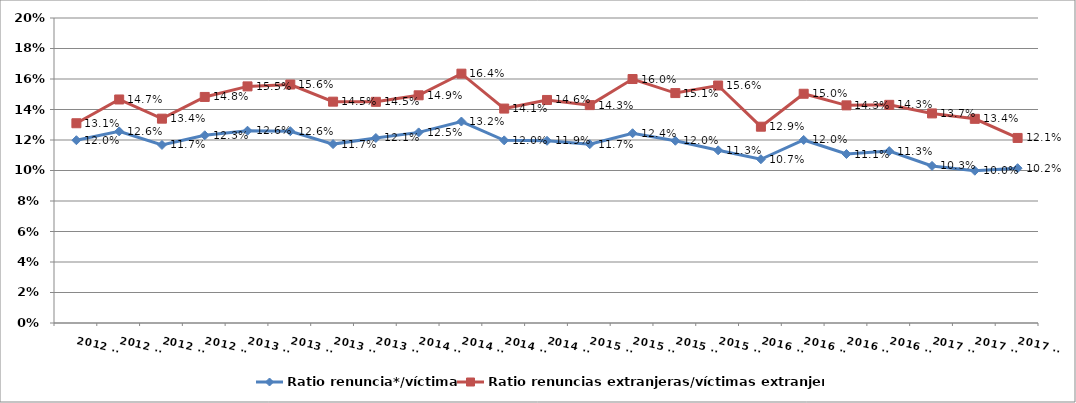
| Category | Ratio renuncia*/víctima | Ratio renuncias extranjeras/víctimas extranjeras |
|---|---|---|
| 2012 T1 | 0.12 | 0.131 |
| 2012 T2 | 0.126 | 0.147 |
| 2012 T3 | 0.117 | 0.134 |
| 2012 T4 | 0.123 | 0.148 |
| 2013 T1 | 0.126 | 0.155 |
| 2013 T2 | 0.126 | 0.156 |
| 2013 T3 | 0.117 | 0.145 |
| 2013 T4 | 0.121 | 0.145 |
| 2014 T1 | 0.125 | 0.149 |
| 2014 T2 | 0.132 | 0.164 |
| 2014 T3 | 0.12 | 0.141 |
| 2014 T4 | 0.119 | 0.146 |
| 2015 T1 | 0.117 | 0.143 |
| 2015 T2 | 0.124 | 0.16 |
| 2015 T3 | 0.12 | 0.151 |
| 2015 T4 | 0.113 | 0.156 |
| 2016 T1 | 0.107 | 0.129 |
| 2016 T2 | 0.12 | 0.15 |
| 2016 T3 | 0.111 | 0.143 |
| 2016 T4 | 0.113 | 0.143 |
| 2017 T1 | 0.103 | 0.137 |
| 2017 T2 | 0.1 | 0.134 |
| 2017 T3 | 0.102 | 0.121 |